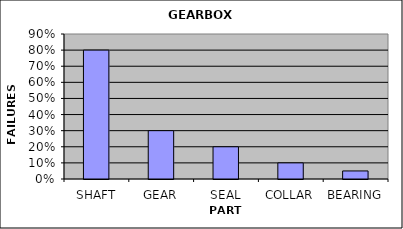
| Category | FAILURES |
|---|---|
| SHAFT | 0.8 |
| GEAR | 0.3 |
| SEAL | 0.2 |
| COLLAR | 0.1 |
| BEARING | 0.05 |